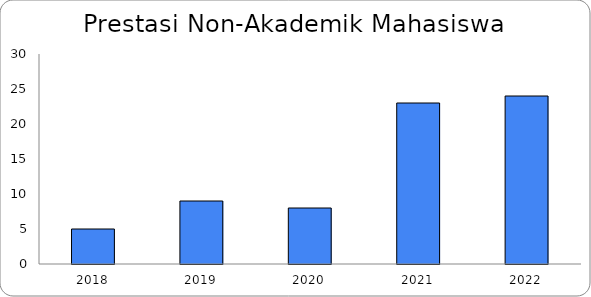
| Category | Jumlah |
|---|---|
| 2018.0 | 5 |
| 2019.0 | 9 |
| 2020.0 | 8 |
| 2021.0 | 23 |
| 2022.0 | 24 |